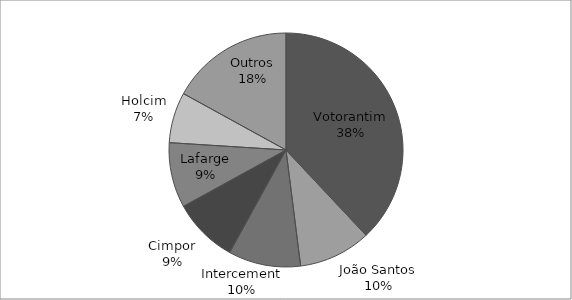
| Category | Series 0 |
|---|---|
| Votorantim | 0.38 |
| João Santos | 0.1 |
| Intercement | 0.1 |
| Cimpor | 0.09 |
| Lafarge | 0.09 |
| Holcim | 0.07 |
| Outros | 0.17 |